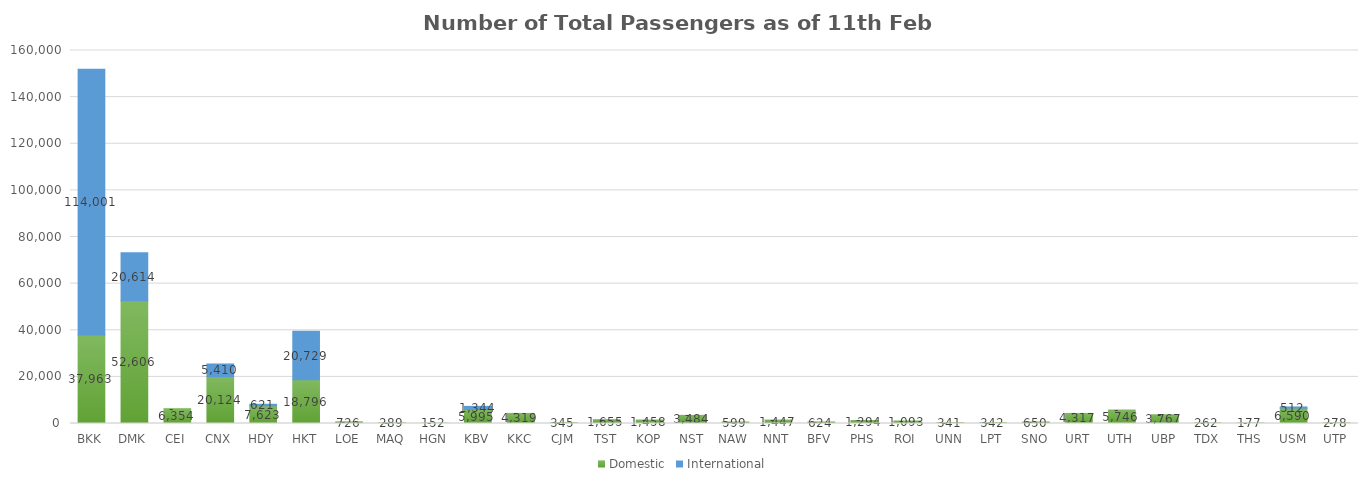
| Category | Domestic | International |
|---|---|---|
| BKK | 37963 | 114001 |
| DMK | 52606 | 20614 |
| CEI | 6354 | 0 |
| CNX | 20124 | 5410 |
| HDY | 7623 | 621 |
| HKT | 18796 | 20729 |
| LOE | 726 | 0 |
| MAQ | 289 | 0 |
| HGN | 152 | 0 |
| KBV | 5995 | 1344 |
| KKC | 4319 | 0 |
| CJM | 345 | 0 |
| TST | 1655 | 0 |
| KOP | 1458 | 0 |
| NST | 3484 | 0 |
| NAW | 599 | 0 |
| NNT | 1447 | 0 |
| BFV | 624 | 0 |
| PHS | 1294 | 0 |
| ROI | 1093 | 0 |
| UNN | 341 | 0 |
| LPT | 342 | 0 |
| SNO | 650 | 0 |
| URT | 4317 | 0 |
| UTH | 5746 | 0 |
| UBP | 3767 | 0 |
| TDX | 262 | 0 |
| THS | 177 | 0 |
| USM | 6590 | 512 |
| UTP | 278 | 0 |